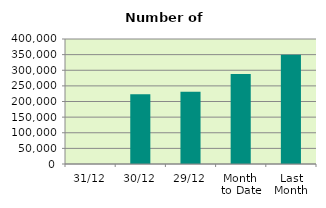
| Category | Series 0 |
|---|---|
| 31/12 | 0 |
| 30/12 | 223158 |
| 29/12 | 231346 |
| Month 
to Date | 288312.667 |
| Last
Month | 349295 |